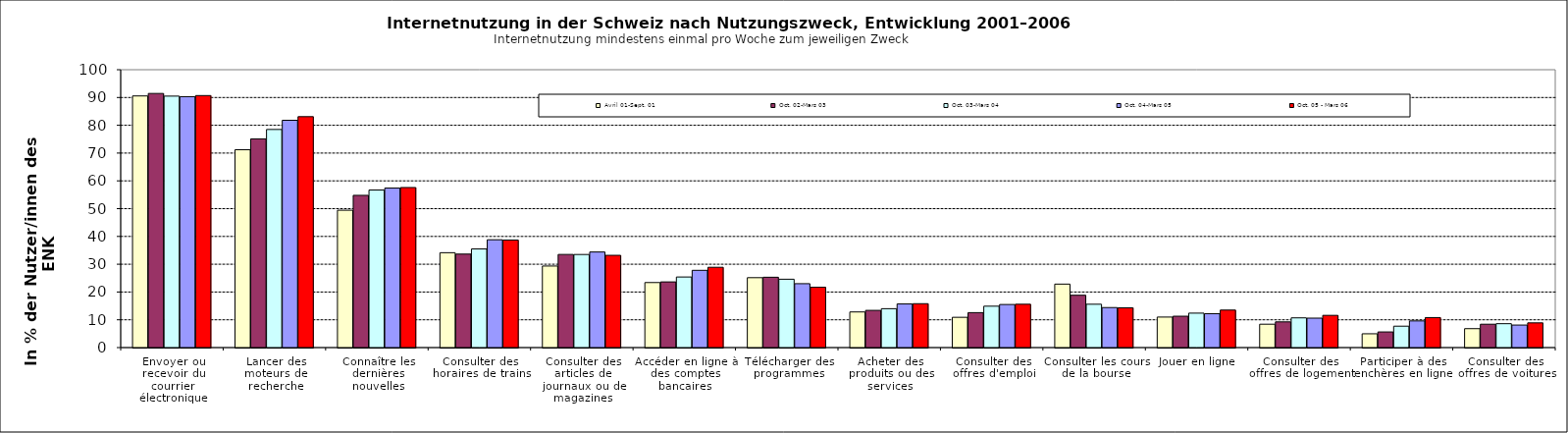
| Category | Avril 01-Sept. 01 | Oct. 02-Mars 03 | Oct. 03-Mars 04 | Oct. 04-Mars 05 | Oct. 05 - Mars 06 |
|---|---|---|---|---|---|
| Envoyer ou recevoir du courrier électronique | 90.559 | 91.456 | 90.5 | 90.3 | 90.7 |
| Lancer des moteurs de recherche | 71.205 | 75.114 | 78.5 | 81.8 | 83.1 |
| Connaître les dernières nouvelles | 49.433 | 54.789 | 56.7 | 57.4 | 57.6 |
| Consulter des horaires de trains | 34.147 | 33.65 | 35.5 | 38.8 | 38.7 |
| Consulter des articles de journaux ou de magazines | 29.351 | 33.514 | 33.5 | 34.4 | 33.2 |
| Accéder en ligne à des comptes bancaires | 23.4 | 23.631 | 25.4 | 27.8 | 28.9 |
| Télécharger des programmes | 25.155 | 25.309 | 24.6 | 23 | 21.7 |
| Acheter des produits ou des services | 12.824 | 13.392 | 14 | 15.7 | 15.8 |
| Consulter des offres d'emploi | 10.897 | 12.578 | 14.9 | 15.5 | 15.6 |
| Consulter les cours de la bourse | 22.843 | 18.834 | 15.6 | 14.4 | 14.3 |
| Jouer en ligne | 10.983 | 11.29 | 12.4 | 12.2 | 13.5 |
| Consulter des offres de logement | 8.414 | 9.256 | 10.7 | 10.6 | 11.6 |
| Participer à des enchères en ligne | 4.967 | 5.628 | 7.7 | 9.6 | 10.8 |
| Consulter des offres de voitures | 6.808 | 8.408 | 8.6 | 8.1 | 8.9 |